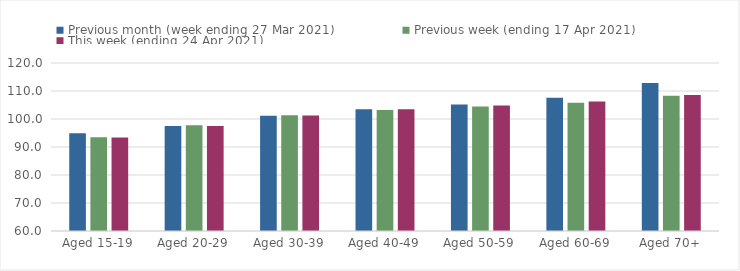
| Category | Previous month (week ending 27 Mar 2021) | Previous week (ending 17 Apr 2021) | This week (ending 24 Apr 2021) |
|---|---|---|---|
| Aged 15-19 | 94.87 | 93.45 | 93.36 |
| Aged 20-29 | 97.52 | 97.78 | 97.53 |
| Aged 30-39 | 101.17 | 101.33 | 101.25 |
| Aged 40-49 | 103.48 | 103.22 | 103.51 |
| Aged 50-59 | 105.16 | 104.42 | 104.86 |
| Aged 60-69 | 107.63 | 105.79 | 106.24 |
| Aged 70+ | 112.83 | 108.32 | 108.53 |